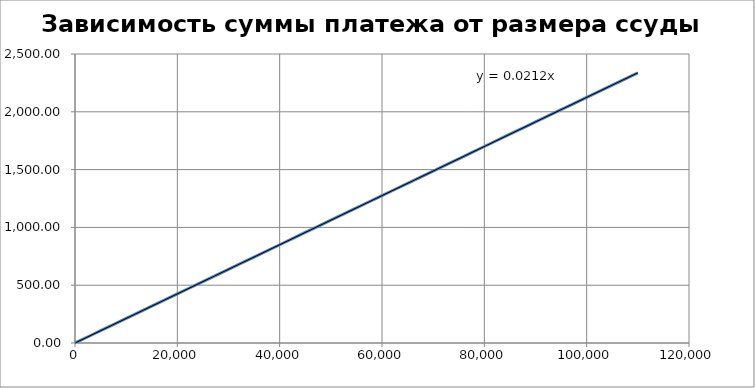
| Category | Платеж |
|---|---|
| 0.0 | 0 |
| 5000.0 | 106.235 |
| 10000.0 | 212.47 |
| 15000.0 | 318.706 |
| 20000.0 | 424.941 |
| 25000.0 | 531.176 |
| 30000.0 | 637.411 |
| 35000.0 | 743.647 |
| 40000.0 | 849.882 |
| 45000.0 | 956.117 |
| 50000.0 | 1062.352 |
| 55000.0 | 1168.587 |
| 60000.0 | 1274.823 |
| 65000.0 | 1381.058 |
| 70000.0 | 1487.293 |
| 75000.0 | 1593.528 |
| 80000.0 | 1699.764 |
| 85000.0 | 1805.999 |
| 90000.0 | 1912.234 |
| 95000.0 | 2018.469 |
| 100000.0 | 2124.704 |
| 105000.0 | 2230.94 |
| 110000.0 | 2337.175 |